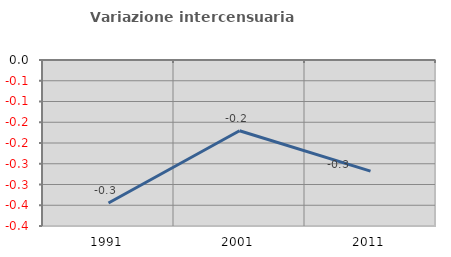
| Category | Variazione intercensuaria annua |
|---|---|
| 1991.0 | -0.344 |
| 2001.0 | -0.17 |
| 2011.0 | -0.268 |